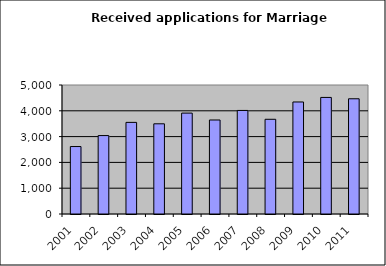
| Category | Series 0 |
|---|---|
| 2001.0 | 2615 |
| 2002.0 | 3040 |
| 2003.0 | 3551 |
| 2004.0 | 3496 |
| 2005.0 | 3911 |
| 2006.0 | 3644 |
| 2007.0 | 4014 |
| 2008.0 | 3671 |
| 2009.0 | 4342 |
| 2010.0 | 4518 |
| 2011.0 | 4466 |